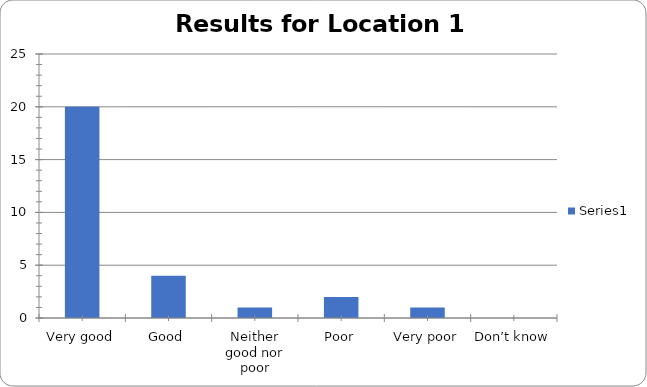
| Category | Series 0 |
|---|---|
| Very good | 20 |
| Good | 4 |
| Neither good nor poor | 1 |
| Poor | 2 |
| Very poor | 1 |
| Don’t know | 0 |